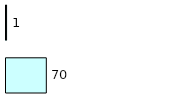
| Category | Series 0 | Series 1 |
|---|---|---|
| 0 | 70 | 1 |